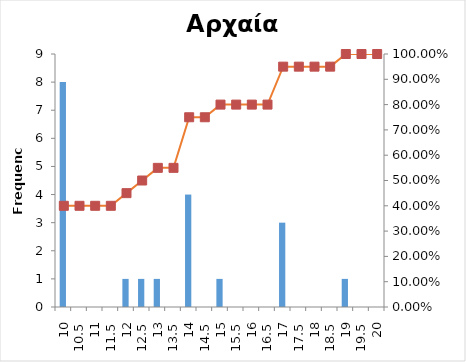
| Category | Series 0 |
|---|---|
| 10 | 8 |
| 10,5 | 0 |
| 11 | 0 |
| 11,5 | 0 |
| 12 | 1 |
| 12,5 | 1 |
| 13 | 1 |
| 13,5 | 0 |
| 14 | 4 |
| 14,5 | 0 |
| 15 | 1 |
| 15,5 | 0 |
| 16 | 0 |
| 16,5 | 0 |
| 17 | 3 |
| 17,5 | 0 |
| 18 | 0 |
| 18,5 | 0 |
| 19 | 1 |
| 19,5 | 0 |
| 20 | 0 |